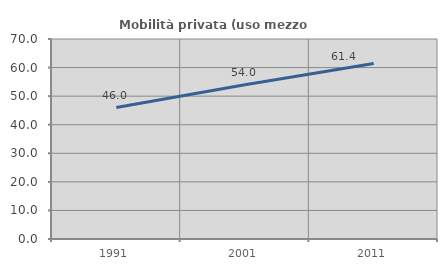
| Category | Mobilità privata (uso mezzo privato) |
|---|---|
| 1991.0 | 46 |
| 2001.0 | 54.011 |
| 2011.0 | 61.429 |